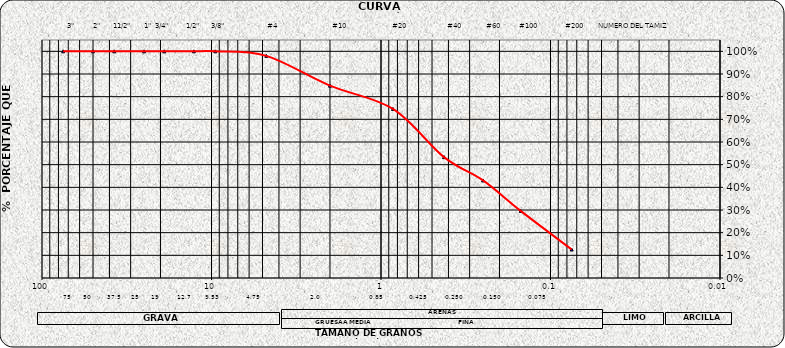
| Category | Series 0 |
|---|---|
| 75.0 | 1 |
| 50.0 | 1 |
| 37.5 | 1 |
| 25.0 | 1 |
| 19.0 | 1 |
| 12.7 | 1 |
| 9.5 | 1 |
| 4.75 | 0.98 |
| 2.0 | 0.849 |
| 0.85 | 0.746 |
| 0.425 | 0.533 |
| 0.25 | 0.43 |
| 0.15 | 0.296 |
| 0.075 | 0.126 |
| nan | 0 |